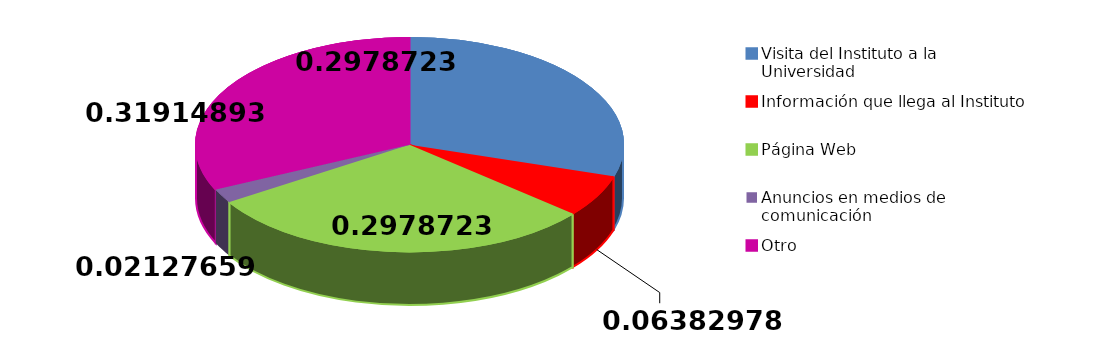
| Category | Sí | No |
|---|---|---|
| Visita del Instituto a la Universidad | 14 | 96 |
| Información que llega al Instituto | 3 | 97 |
| Página Web | 14 | 98 |
| Anuncios en medios de comunicación | 1 | 99 |
| Otro | 15 | 100 |